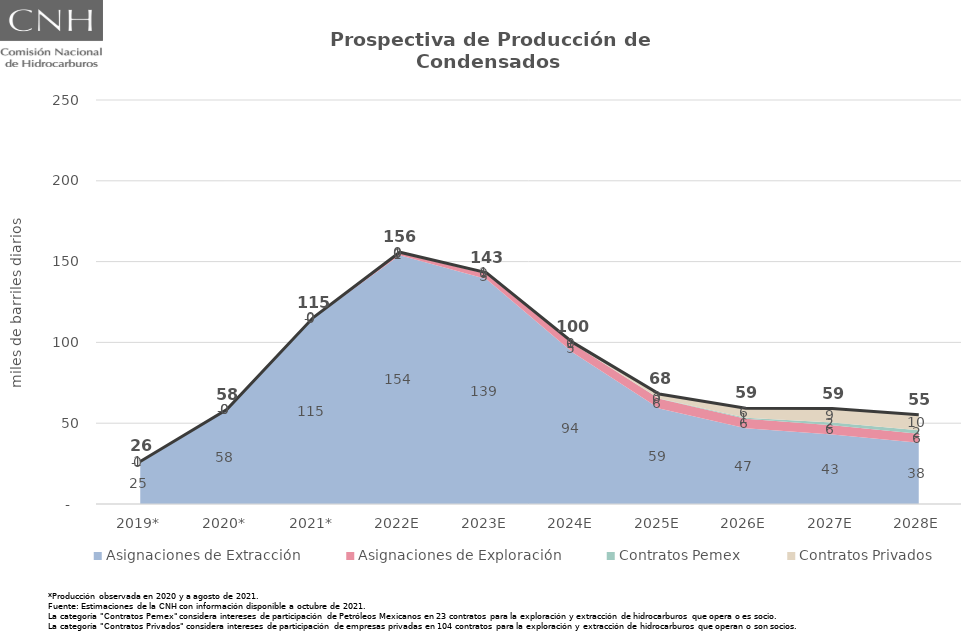
| Category | Total |
|---|---|
| 2019* | 26.35 |
| 2020* | 58.4 |
| 2021* | 115.364 |
| 2022E | 155.819 |
| 2023E | 143.215 |
| 2024E | 100.005 |
| 2025E | 68.017 |
| 2026E | 59.201 |
| 2027E | 59.051 |
| 2028E | 55.173 |